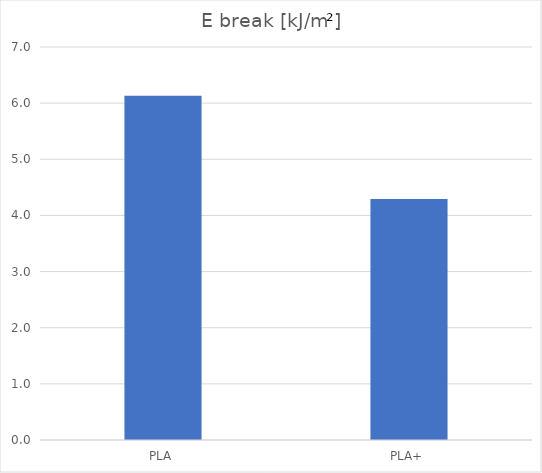
| Category | kJ/m² |
|---|---|
| PLA | 6.131 |
| PLA+ | 4.292 |